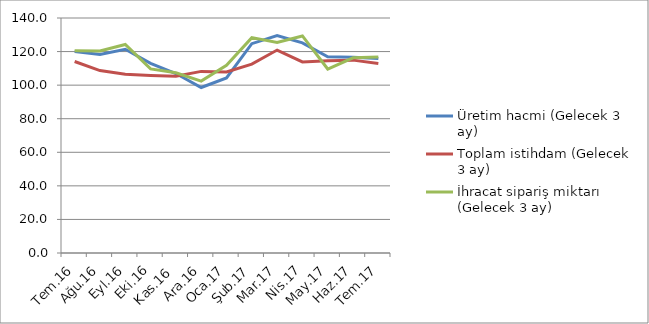
| Category | Üretim hacmi (Gelecek 3 ay) | Toplam istihdam (Gelecek 3 ay) | İhracat sipariş miktarı (Gelecek 3 ay) |
|---|---|---|---|
| Tem.16 | 120.1 | 114.1 | 120.5 |
| Ağu.16 | 118.3 | 108.7 | 120.4 |
| Eyl.16 | 121.4 | 106.5 | 124.2 |
| Eki.16 | 113 | 105.8 | 109.7 |
| Kas.16 | 106.9 | 105.3 | 107.4 |
| Ara.16 | 98.6 | 108.2 | 102.4 |
| Oca.17 | 104.3 | 107.9 | 111.8 |
| Şub.17 | 124.7 | 112.5 | 128.3 |
| Mar.17 | 129.5 | 120.9 | 125.4 |
| Nis.17 | 125.2 | 113.8 | 129.3 |
| May.17 | 116.9 | 114.5 | 109.6 |
| Haz.17 | 116.6 | 114.9 | 116.3 |
| Tem.17 | 115.8 | 112.9 | 116.7 |